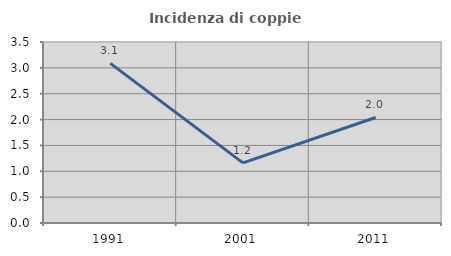
| Category | Incidenza di coppie miste |
|---|---|
| 1991.0 | 3.086 |
| 2001.0 | 1.163 |
| 2011.0 | 2.041 |